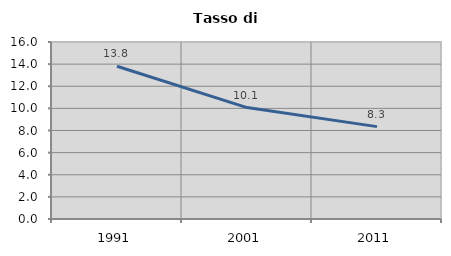
| Category | Tasso di disoccupazione   |
|---|---|
| 1991.0 | 13.804 |
| 2001.0 | 10.072 |
| 2011.0 | 8.349 |